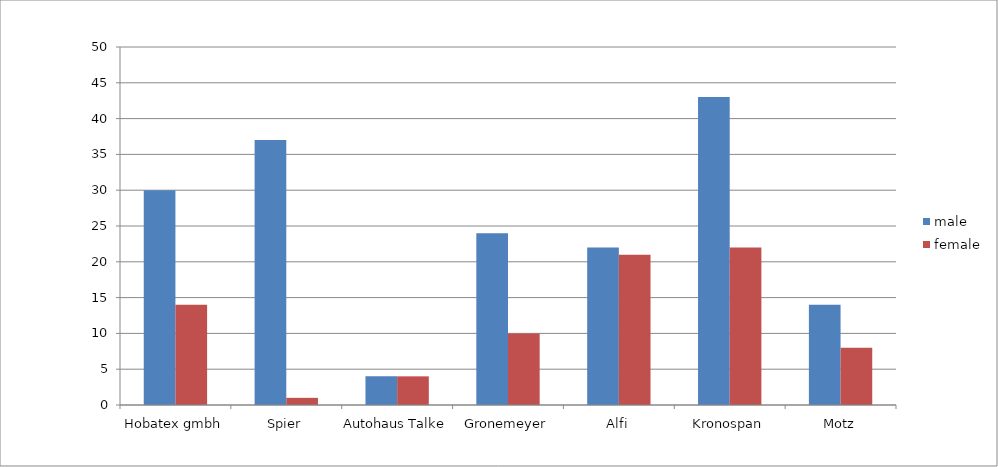
| Category | male   | female |
|---|---|---|
| Hobatex gmbh | 30 | 14 |
| Spier | 37 | 1 |
| Autohaus Talke | 4 | 4 |
| Gronemeyer | 24 | 10 |
| Alfi | 22 | 21 |
| Kronospan | 43 | 22 |
| Motz | 14 | 8 |